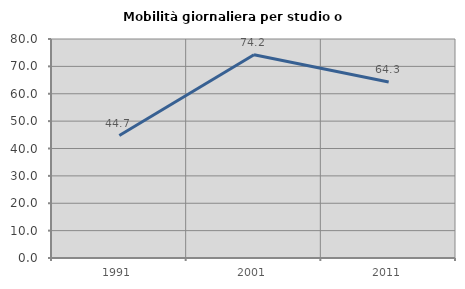
| Category | Mobilità giornaliera per studio o lavoro |
|---|---|
| 1991.0 | 44.736 |
| 2001.0 | 74.231 |
| 2011.0 | 64.286 |